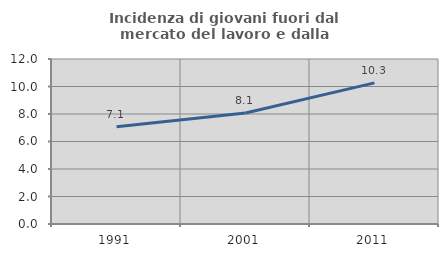
| Category | Incidenza di giovani fuori dal mercato del lavoro e dalla formazione  |
|---|---|
| 1991.0 | 7.069 |
| 2001.0 | 8.073 |
| 2011.0 | 10.264 |